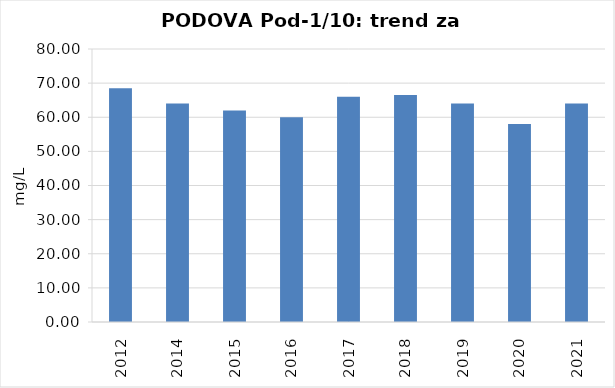
| Category | Vsota |
|---|---|
| 2012 | 68.5 |
| 2014 | 64 |
| 2015 | 62 |
| 2016 | 60 |
| 2017 | 66 |
| 2018 | 66.5 |
| 2019 | 64 |
| 2020 | 58 |
| 2021 | 64 |